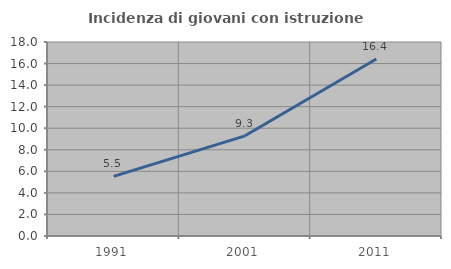
| Category | Incidenza di giovani con istruzione universitaria |
|---|---|
| 1991.0 | 5.532 |
| 2001.0 | 9.295 |
| 2011.0 | 16.429 |